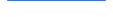
| Category | Series 0 |
|---|---|
| 0 | 175 |
| 1 | 159 |
| 2 | 139 |
| 3 | 124 |
| 4 | 138 |
| 5 | 145 |
| 6 | 136 |
| 7 | 127 |
| 8 | 125 |